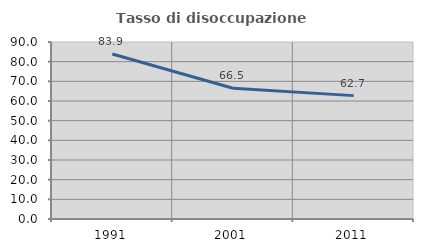
| Category | Tasso di disoccupazione giovanile  |
|---|---|
| 1991.0 | 83.902 |
| 2001.0 | 66.516 |
| 2011.0 | 62.733 |